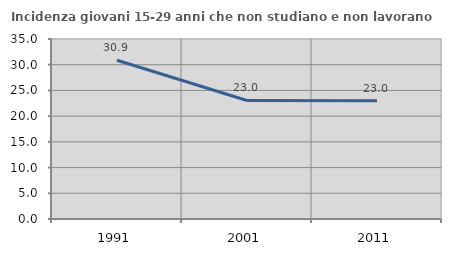
| Category | Incidenza giovani 15-29 anni che non studiano e non lavorano  |
|---|---|
| 1991.0 | 30.876 |
| 2001.0 | 23.045 |
| 2011.0 | 22.989 |